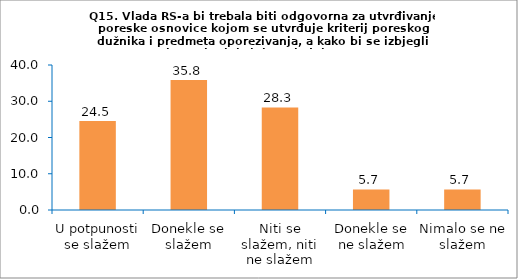
| Category | Series 0 |
|---|---|
| U potpunosti se slažem | 24.528 |
| Donekle se slažem | 35.849 |
| Niti se slažem, niti ne slažem | 28.302 |
| Donekle se ne slažem | 5.66 |
| Nimalo se ne slažem | 5.66 |